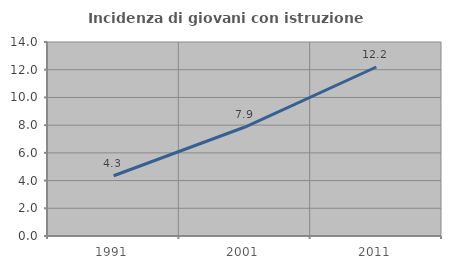
| Category | Incidenza di giovani con istruzione universitaria |
|---|---|
| 1991.0 | 4.348 |
| 2001.0 | 7.865 |
| 2011.0 | 12.195 |